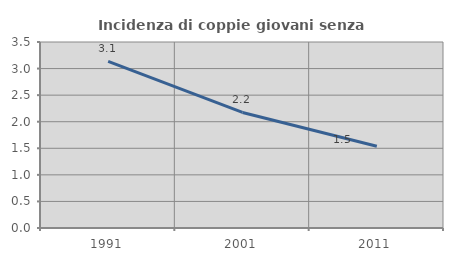
| Category | Incidenza di coppie giovani senza figli |
|---|---|
| 1991.0 | 3.137 |
| 2001.0 | 2.174 |
| 2011.0 | 1.538 |